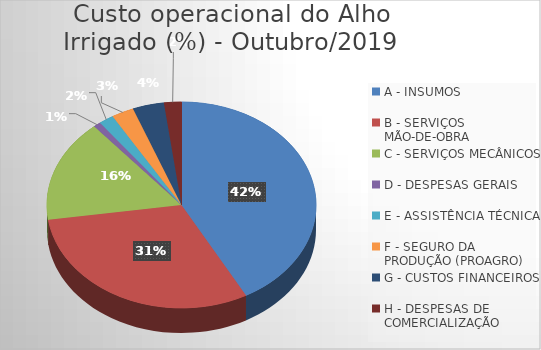
| Category | Series 0 |
|---|---|
| A - INSUMOS | 42.053 |
| B - SERVIÇOS MÃO-DE-OBRA | 30.635 |
| C - SERVIÇOS MECÂNICOS | 16.084 |
| D - DESPESAS GERAIS  | 0.888 |
| E - ASSISTÊNCIA TÉCNICA | 1.793 |
| F - SEGURO DA PRODUÇÃO (PROAGRO) | 2.69 |
| G - CUSTOS FINANCEIROS | 3.766 |
| H - DESPESAS DE COMERCIALIZAÇÃO | 2.092 |